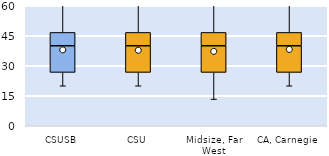
| Category | 25th | 50th | 75th |
|---|---|---|---|
| CSUSB | 26.667 | 13.333 | 6.667 |
| CSU | 26.667 | 13.333 | 6.667 |
| Midsize, Far West | 26.667 | 13.333 | 6.667 |
| CA, Carnegie | 26.667 | 13.333 | 6.667 |